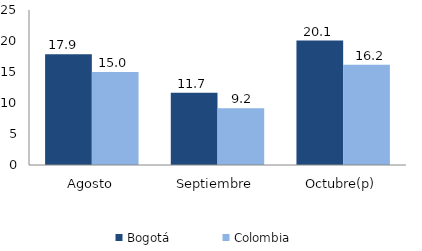
| Category | Bogotá | Colombia |
|---|---|---|
| Agosto | 17.878 | 15.014 |
| Septiembre | 11.67 | 9.159 |
| Octubre(p) | 20.071 | 16.173 |